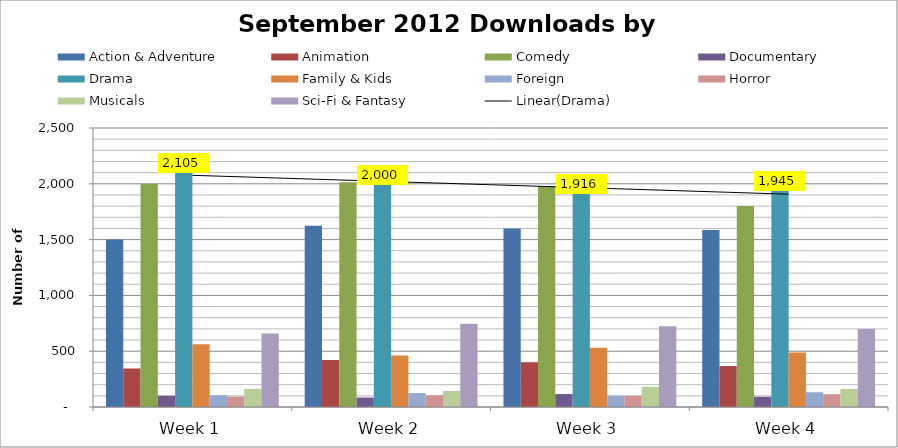
| Category | Action & Adventure | Animation | Comedy | Documentary | Drama | Family & Kids | Foreign | Horror | Musicals | Sci-Fi & Fantasy |
|---|---|---|---|---|---|---|---|---|---|---|
| Week 1 | 1500 | 345 | 2000 | 101 | 2105 | 562 | 105 | 93 | 162 | 658 |
| Week 2 | 1625 | 421 | 2015 | 85 | 2000 | 461 | 125 | 105 | 143 | 745 |
| Week 3 | 1600 | 400 | 1975 | 116 | 1916 | 532 | 101 | 100 | 181 | 723 |
| Week 4 | 1585 | 367 | 1800 | 92 | 1945 | 488 | 132 | 115 | 162 | 699 |